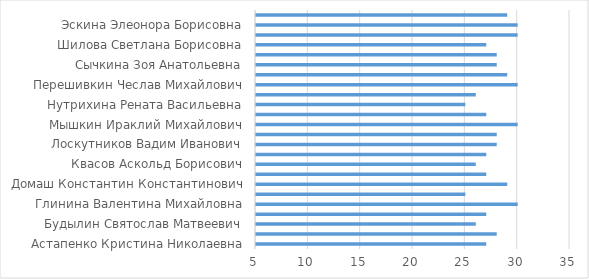
| Category | Series 0 |
|---|---|
| Астапенко Кристина Николаевна | 27 |
| Батрутдинова Жанна Сернеевна | 28 |
| Будылин Святослав Матвеевич | 26 |
| Бутусов Осип Игоревич | 27 |
| Глинина Валентина Михайловна | 30 |
| Грекова Ксения Александровна | 25 |
| Домаш Константин Константинович | 29 |
| Квасникова Зоя Борисовна | 27 |
| Квасов Аскольд Борисович | 26 |
| Куанышбаева Оксана Игоревна | 27 |
| Лоскутников Вадим Иванович | 28 |
| Максудов Егор Петрович | 28 |
| Мышкин Ираклий Михайлович | 30 |
| Никифорова Агния Спартаковна | 27 |
| Нутрихина Рената Васильевна | 25 |
| Перехваткин Венедикт Юрьевич | 26 |
| Перешивкин Чеслав Михайлович | 30 |
| Суслов Никанор Юлианович | 29 |
| Сычкина Зоя Анатольевна | 28 |
| Швечикова Лидия Петровна | 28 |
| Шилова Светлана Борисовна | 27 |
| Шулёв Руслан Николаевич | 30 |
| Эскина Элеонора Борисовна | 30 |
| Ямалтдинов Владилен Николаевич | 29 |